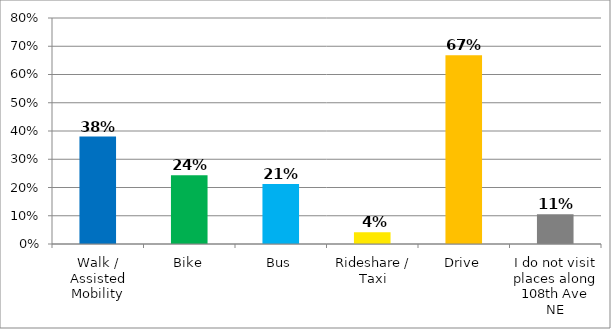
| Category | Responses |
|---|---|
| Walk / Assisted Mobility | 0.38 |
| Bike | 0.244 |
| Bus | 0.212 |
| Rideshare / Taxi | 0.041 |
| Drive | 0.668 |
| I do not visit places along 108th Ave NE | 0.105 |